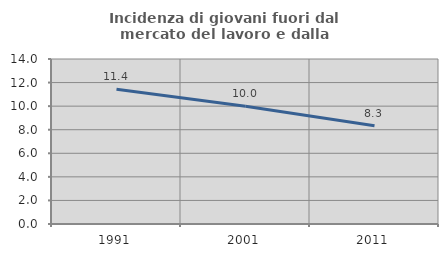
| Category | Incidenza di giovani fuori dal mercato del lavoro e dalla formazione  |
|---|---|
| 1991.0 | 11.429 |
| 2001.0 | 10 |
| 2011.0 | 8.333 |